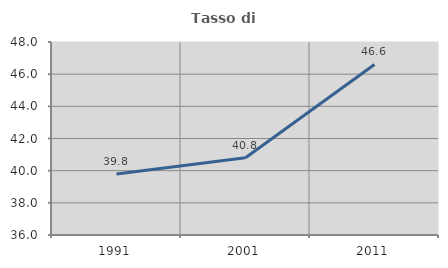
| Category | Tasso di occupazione   |
|---|---|
| 1991.0 | 39.792 |
| 2001.0 | 40.806 |
| 2011.0 | 46.606 |